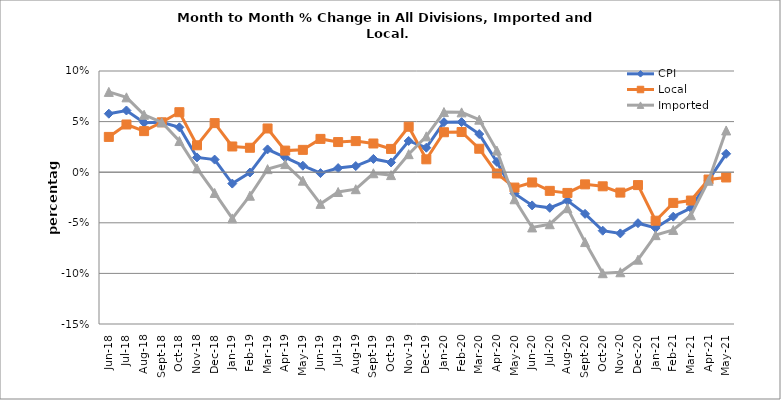
| Category | CPI | Local | Imported |
|---|---|---|---|
| 2018-06-01 | 0.058 | 0.035 | 0.079 |
| 2018-07-01 | 0.061 | 0.047 | 0.074 |
| 2018-08-01 | 0.049 | 0.041 | 0.057 |
| 2018-09-01 | 0.049 | 0.049 | 0.049 |
| 2018-10-01 | 0.044 | 0.059 | 0.031 |
| 2018-11-01 | 0.015 | 0.027 | 0.004 |
| 2018-12-01 | 0.012 | 0.049 | -0.021 |
| 2019-01-01 | -0.011 | 0.025 | -0.046 |
| 2019-02-01 | 0 | 0.024 | -0.023 |
| 2019-03-01 | 0.023 | 0.043 | 0.003 |
| 2019-04-01 | 0.015 | 0.021 | 0.008 |
| 2019-05-01 | 0.006 | 0.022 | -0.008 |
| 2019-06-01 | -0.001 | 0.033 | -0.031 |
| 2019-07-01 | 0.004 | 0.03 | -0.02 |
| 2019-08-01 | 0.006 | 0.031 | -0.017 |
| 2019-09-01 | 0.013 | 0.028 | -0.001 |
| 2019-10-01 | 0.01 | 0.023 | -0.003 |
| 2019-11-01 | 0.031 | 0.045 | 0.018 |
| 2019-12-01 | 0.024 | 0.013 | 0.035 |
| 2020-01-01 | 0.049 | 0.039 | 0.059 |
| 2020-02-01 | 0.05 | 0.04 | 0.059 |
| 2020-03-01 | 0.038 | 0.023 | 0.052 |
| 2020-04-01 | 0.01 | -0.001 | 0.021 |
| 2020-05-01 | -0.021 | -0.015 | -0.027 |
| 2020-06-01 | -0.033 | -0.01 | -0.055 |
| 2020-07-01 | -0.035 | -0.018 | -0.051 |
| 2020-08-01 | -0.028 | -0.02 | -0.036 |
| 2020-09-01 | -0.041 | -0.012 | -0.069 |
| 2020-10-01 | -0.058 | -0.014 | -0.1 |
| 2020-11-01 | -0.06 | -0.02 | -0.099 |
| 2020-12-01 | -0.05 | -0.013 | -0.086 |
| 2021-01-01 | -0.055 | -0.048 | -0.062 |
| 2021-02-01 | -0.044 | -0.03 | -0.057 |
| 2021-03-01 | -0.035 | -0.028 | -0.043 |
| 2021-04-01 | -0.008 | -0.007 | -0.008 |
| 2021-05-01 | 0.018 | -0.005 | 0.041 |